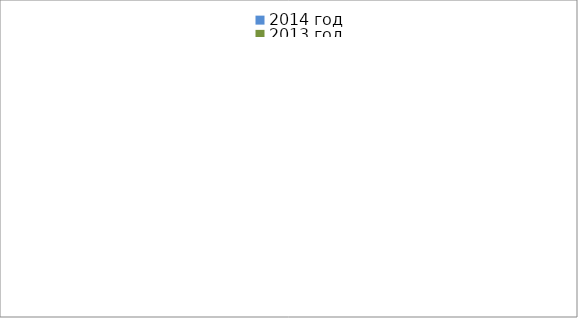
| Category | 2014 год | 2013 год |
|---|---|---|
|  - поджог | 10 | 24 |
|  - неосторожное обращение с огнём | 29 | 33 |
|  - НПТЭ электрооборудования | 14 | 18 |
|  - НПУ и Э печей | 46 | 34 |
|  - НПУ и Э транспортных средств | 45 | 44 |
|   -Шалость с огнем детей | 0 | 3 |
|  -НППБ при эксплуатации эл.приборов | 16 | 19 |
|  - курение | 17 | 9 |
| - прочие | 66 | 57 |
| - не установленные причины | 9 | 1 |